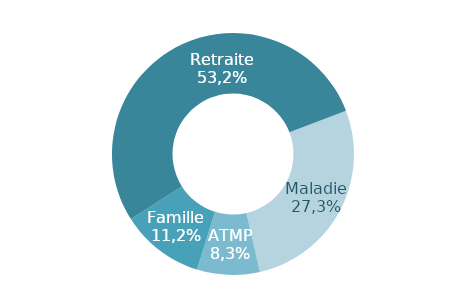
| Category | Series 0 |
|---|---|
| ü retraite | 0.273 |
| ü maladie-maternité-invalidité-décès | 0.084 |
| ü famille | 0.112 |
| ü accident du travail et maladie professionnelle | 0.532 |